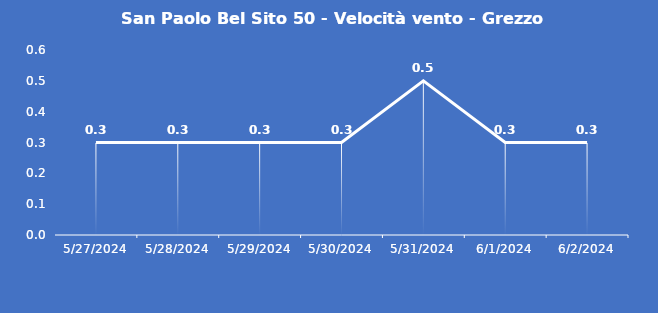
| Category | San Paolo Bel Sito 50 - Velocità vento - Grezzo (m/s) |
|---|---|
| 5/27/24 | 0.3 |
| 5/28/24 | 0.3 |
| 5/29/24 | 0.3 |
| 5/30/24 | 0.3 |
| 5/31/24 | 0.5 |
| 6/1/24 | 0.3 |
| 6/2/24 | 0.3 |